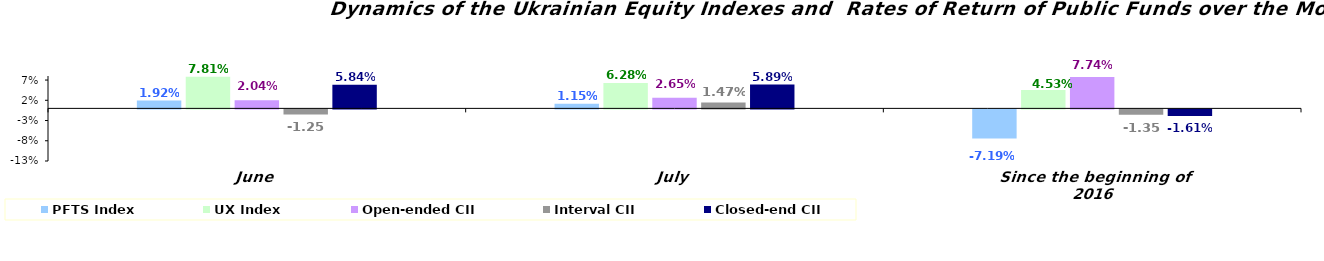
| Category | PFTS Index | UX Index | Open-ended CII | Interval CII | Closed-end CII |
|---|---|---|---|---|---|
| June | 0.019 | 0.078 | 0.02 | -0.012 | 0.058 |
| July | 0.011 | 0.063 | 0.027 | 0.015 | 0.059 |
| Since the beginning of 2016 | -0.072 | 0.045 | 0.077 | -0.013 | -0.016 |